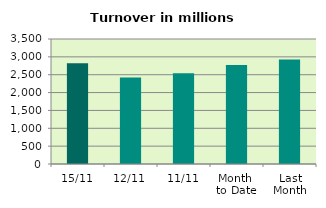
| Category | Series 0 |
|---|---|
| 15/11 | 2818.574 |
| 12/11 | 2424.83 |
| 11/11 | 2538.38 |
| Month 
to Date | 2773.108 |
| Last
Month | 2924.951 |